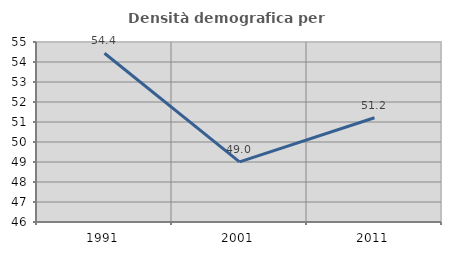
| Category | Densità demografica |
|---|---|
| 1991.0 | 54.438 |
| 2001.0 | 49.003 |
| 2011.0 | 51.214 |